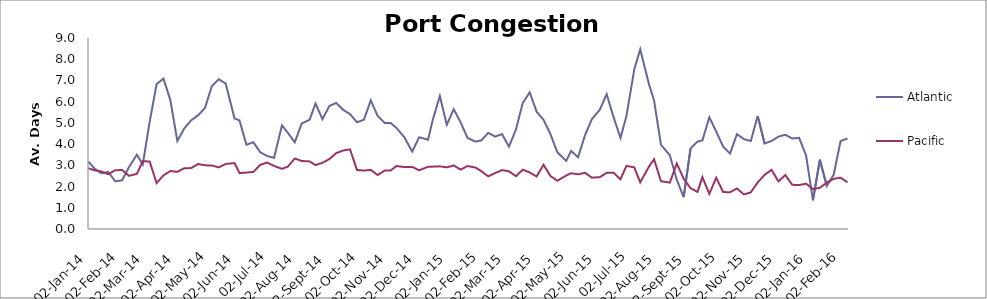
| Category | Atlantic  | Pacific |
|---|---|---|
| 2014-01-02 | 3.167 | 2.863 |
| 2014-01-08 | 2.854 | 2.767 |
| 2014-01-15 | 2.625 | 2.712 |
| 2014-01-22 | 2.688 | 2.582 |
| 2014-01-29 | 2.25 | 2.767 |
| 2014-02-05 | 2.292 | 2.781 |
| 2014-02-12 | 2.917 | 2.507 |
| 2014-02-20 | 3.5 | 2.596 |
| 2014-02-26 | 3.042 | 3.199 |
| 2014-03-05 | 5.059 | 3.178 |
| 2014-03-12 | 6.824 | 2.164 |
| 2014-03-19 | 7.088 | 2.527 |
| 2014-03-26 | 6.059 | 2.733 |
| 2014-04-02 | 4.147 | 2.692 |
| 2014-04-09 | 4.735 | 2.863 |
| 2014-04-16 | 5.118 | 2.87 |
| 2014-04-23 | 5.353 | 3.062 |
| 2014-04-30 | 5.706 | 3 |
| 2014-05-07 | 6.735 | 2.993 |
| 2014-05-14 | 7.059 | 2.904 |
| 2014-05-21 | 6.853 | 3.068 |
| 2014-05-30 | 5.206 | 3.103 |
| 2014-06-04 | 5.118 | 2.637 |
| 2014-06-11 | 3.971 | 2.658 |
| 2014-06-18 | 4.088 | 2.692 |
| 2014-06-25 | 3.618 | 3.021 |
| 2014-07-02 | 3.441 | 3.13 |
| 2014-07-09 | 3.353 | 2.973 |
| 2014-07-17 | 4.882 | 2.836 |
| 2014-07-23 | 4.529 | 2.938 |
| 2014-07-30 | 4.088 | 3.322 |
| 2014-08-06 | 4.971 | 3.205 |
| 2014-08-14 | 5.147 | 3.185 |
| 2014-08-20 | 5.912 | 3.014 |
| 2014-08-27 | 5.176 | 3.116 |
| 2014-09-03 | 5.794 | 3.295 |
| 2014-09-10 | 5.941 | 3.575 |
| 2014-09-17 | 5.618 | 3.699 |
| 2014-09-24 | 5.412 | 3.753 |
| 2014-10-01 | 5.029 | 2.781 |
| 2014-10-08 | 5.147 | 2.753 |
| 2014-10-15 | 6.059 | 2.785 |
| 2014-10-22 | 5.324 | 2.541 |
| 2014-10-29 | 5 | 2.753 |
| 2014-11-04 | 5 | 2.753 |
| 2014-11-10 | 4.765 | 2.966 |
| 2014-11-18 | 4.324 | 2.918 |
| 2014-11-26 | 3.647 | 2.925 |
| 2014-12-03 | 4.324 | 2.767 |
| 2014-12-12 | 4.206 | 2.932 |
| 2014-12-17 | 5.176 | 2.938 |
| 2014-12-24 | 6.265 | 2.952 |
| 2014-12-31 | 4.912 | 2.904 |
| 2015-01-07 | 5.647 | 2.993 |
| 2015-01-14 | 5.029 | 2.801 |
| 2015-01-21 | 4.294 | 2.966 |
| 2015-01-29 | 4.118 | 2.897 |
| 2015-02-04 | 4.176 | 2.726 |
| 2015-02-11 | 4.529 | 2.479 |
| 2015-02-18 | 4.353 | 2.637 |
| 2015-02-25 | 4.471 | 2.774 |
| 2015-03-04 | 3.882 | 2.719 |
| 2015-03-11 | 4.676 | 2.486 |
| 2015-03-18 | 5.941 | 2.795 |
| 2015-03-25 | 6.441 | 2.664 |
| 2015-04-01 | 5.529 | 2.473 |
| 2015-04-08 | 5.147 | 3.027 |
| 2015-04-15 | 4.471 | 2.5 |
| 2015-04-22 | 3.618 | 2.274 |
| 2015-05-01 | 3.206 | 2.521 |
| 2015-05-06 | 3.676 | 2.63 |
| 2015-05-13 | 3.382 | 2.575 |
| 2015-05-20 | 4.412 | 2.651 |
| 2015-05-27 | 5.176 | 2.418 |
| 2015-06-04 | 5.618 | 2.442 |
| 2015-06-11 | 6.353 | 2.645 |
| 2015-06-18 | 5.265 | 2.651 |
| 2015-06-25 | 4.294 | 2.342 |
| 2015-07-01 | 5.324 | 2.973 |
| 2015-07-09 | 7.529 | 2.904 |
| 2015-07-15 | 8.471 | 2.196 |
| 2015-07-24 | 6.794 | 2.952 |
| 2015-07-29 | 6.059 | 3.288 |
| 2015-08-05 | 3.971 | 2.253 |
| 2015-08-14 | 3.471 | 2.185 |
| 2015-08-21 | 2.324 | 3.089 |
| 2015-08-28 | 1.5 | 2.37 |
| 2015-09-04 | 3.794 | 1.925 |
| 2015-09-11 | 4.118 | 1.747 |
| 2015-09-16 | 4.176 | 2.445 |
| 2015-09-23 | 5.265 | 1.658 |
| 2015-09-30 | 4.588 | 2.418 |
| 2015-10-07 | 3.882 | 1.74 |
| 2015-10-14 | 3.559 | 1.733 |
| 2015-10-21 | 4.471 | 1.911 |
| 2015-10-28 | 4.235 | 1.63 |
| 2015-11-04 | 4.147 | 1.726 |
| 2015-11-11 | 5.324 | 2.192 |
| 2015-11-18 | 4.029 | 2.555 |
| 2015-11-25 | 4.147 | 2.788 |
| 2015-12-02 | 4.353 | 2.247 |
| 2015-12-09 | 4.441 | 2.541 |
| 2015-12-16 | 4.265 | 2.082 |
| 2015-12-23 | 4.294 | 2.068 |
| 2015-12-30 | 3.471 | 2.137 |
| 2016-01-06 | 1.353 | 1.884 |
| 2016-01-13 | 3.265 | 1.938 |
| 2016-01-20 | 2.029 | 2.185 |
| 2016-01-27 | 2.559 | 2.363 |
| 2016-02-03 | 4.147 | 2.418 |
| 2016-02-10 | 4.265 | 2.199 |